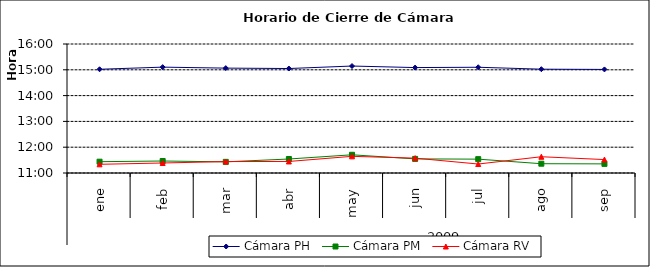
| Category | Cámara PH | Cámara PM | Cámara RV |
|---|---|---|---|
| 0 | 0.626 | 0.477 | 0.472 |
| 1 | 0.629 | 0.478 | 0.474 |
| 2 | 0.628 | 0.476 | 0.477 |
| 3 | 0.627 | 0.481 | 0.477 |
| 4 | 0.631 | 0.488 | 0.485 |
| 5 | 0.629 | 0.481 | 0.482 |
| 6 | 0.629 | 0.481 | 0.473 |
| 7 | 0.626 | 0.473 | 0.485 |
| 8 | 0.626 | 0.473 | 0.48 |